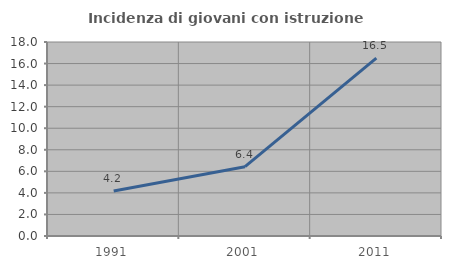
| Category | Incidenza di giovani con istruzione universitaria |
|---|---|
| 1991.0 | 4.167 |
| 2001.0 | 6.434 |
| 2011.0 | 16.505 |